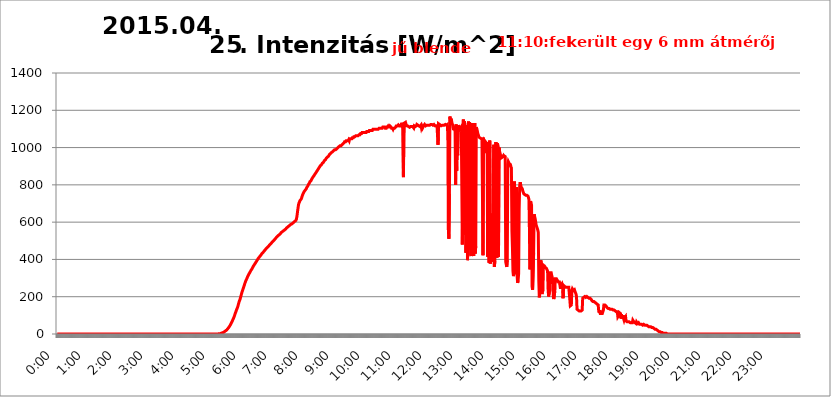
| Category | 2015.04.25. Intenzitás [W/m^2] |
|---|---|
| 0.0 | 0 |
| 0.0006944444444444445 | 0 |
| 0.001388888888888889 | 0 |
| 0.0020833333333333333 | 0 |
| 0.002777777777777778 | 0 |
| 0.003472222222222222 | 0 |
| 0.004166666666666667 | 0 |
| 0.004861111111111111 | 0 |
| 0.005555555555555556 | 0 |
| 0.0062499999999999995 | 0 |
| 0.006944444444444444 | 0 |
| 0.007638888888888889 | 0 |
| 0.008333333333333333 | 0 |
| 0.009027777777777779 | 0 |
| 0.009722222222222222 | 0 |
| 0.010416666666666666 | 0 |
| 0.011111111111111112 | 0 |
| 0.011805555555555555 | 0 |
| 0.012499999999999999 | 0 |
| 0.013194444444444444 | 0 |
| 0.013888888888888888 | 0 |
| 0.014583333333333332 | 0 |
| 0.015277777777777777 | 0 |
| 0.015972222222222224 | 0 |
| 0.016666666666666666 | 0 |
| 0.017361111111111112 | 0 |
| 0.018055555555555557 | 0 |
| 0.01875 | 0 |
| 0.019444444444444445 | 0 |
| 0.02013888888888889 | 0 |
| 0.020833333333333332 | 0 |
| 0.02152777777777778 | 0 |
| 0.022222222222222223 | 0 |
| 0.02291666666666667 | 0 |
| 0.02361111111111111 | 0 |
| 0.024305555555555556 | 0 |
| 0.024999999999999998 | 0 |
| 0.025694444444444447 | 0 |
| 0.02638888888888889 | 0 |
| 0.027083333333333334 | 0 |
| 0.027777777777777776 | 0 |
| 0.02847222222222222 | 0 |
| 0.029166666666666664 | 0 |
| 0.029861111111111113 | 0 |
| 0.030555555555555555 | 0 |
| 0.03125 | 0 |
| 0.03194444444444445 | 0 |
| 0.03263888888888889 | 0 |
| 0.03333333333333333 | 0 |
| 0.034027777777777775 | 0 |
| 0.034722222222222224 | 0 |
| 0.035416666666666666 | 0 |
| 0.036111111111111115 | 0 |
| 0.03680555555555556 | 0 |
| 0.0375 | 0 |
| 0.03819444444444444 | 0 |
| 0.03888888888888889 | 0 |
| 0.03958333333333333 | 0 |
| 0.04027777777777778 | 0 |
| 0.04097222222222222 | 0 |
| 0.041666666666666664 | 0 |
| 0.042361111111111106 | 0 |
| 0.04305555555555556 | 0 |
| 0.043750000000000004 | 0 |
| 0.044444444444444446 | 0 |
| 0.04513888888888889 | 0 |
| 0.04583333333333334 | 0 |
| 0.04652777777777778 | 0 |
| 0.04722222222222222 | 0 |
| 0.04791666666666666 | 0 |
| 0.04861111111111111 | 0 |
| 0.049305555555555554 | 0 |
| 0.049999999999999996 | 0 |
| 0.05069444444444445 | 0 |
| 0.051388888888888894 | 0 |
| 0.052083333333333336 | 0 |
| 0.05277777777777778 | 0 |
| 0.05347222222222222 | 0 |
| 0.05416666666666667 | 0 |
| 0.05486111111111111 | 0 |
| 0.05555555555555555 | 0 |
| 0.05625 | 0 |
| 0.05694444444444444 | 0 |
| 0.057638888888888885 | 0 |
| 0.05833333333333333 | 0 |
| 0.05902777777777778 | 0 |
| 0.059722222222222225 | 0 |
| 0.06041666666666667 | 0 |
| 0.061111111111111116 | 0 |
| 0.06180555555555556 | 0 |
| 0.0625 | 0 |
| 0.06319444444444444 | 0 |
| 0.06388888888888888 | 0 |
| 0.06458333333333334 | 0 |
| 0.06527777777777778 | 0 |
| 0.06597222222222222 | 0 |
| 0.06666666666666667 | 0 |
| 0.06736111111111111 | 0 |
| 0.06805555555555555 | 0 |
| 0.06874999999999999 | 0 |
| 0.06944444444444443 | 0 |
| 0.07013888888888889 | 0 |
| 0.07083333333333333 | 0 |
| 0.07152777777777779 | 0 |
| 0.07222222222222223 | 0 |
| 0.07291666666666667 | 0 |
| 0.07361111111111111 | 0 |
| 0.07430555555555556 | 0 |
| 0.075 | 0 |
| 0.07569444444444444 | 0 |
| 0.0763888888888889 | 0 |
| 0.07708333333333334 | 0 |
| 0.07777777777777778 | 0 |
| 0.07847222222222222 | 0 |
| 0.07916666666666666 | 0 |
| 0.0798611111111111 | 0 |
| 0.08055555555555556 | 0 |
| 0.08125 | 0 |
| 0.08194444444444444 | 0 |
| 0.08263888888888889 | 0 |
| 0.08333333333333333 | 0 |
| 0.08402777777777777 | 0 |
| 0.08472222222222221 | 0 |
| 0.08541666666666665 | 0 |
| 0.08611111111111112 | 0 |
| 0.08680555555555557 | 0 |
| 0.08750000000000001 | 0 |
| 0.08819444444444445 | 0 |
| 0.08888888888888889 | 0 |
| 0.08958333333333333 | 0 |
| 0.09027777777777778 | 0 |
| 0.09097222222222222 | 0 |
| 0.09166666666666667 | 0 |
| 0.09236111111111112 | 0 |
| 0.09305555555555556 | 0 |
| 0.09375 | 0 |
| 0.09444444444444444 | 0 |
| 0.09513888888888888 | 0 |
| 0.09583333333333333 | 0 |
| 0.09652777777777777 | 0 |
| 0.09722222222222222 | 0 |
| 0.09791666666666667 | 0 |
| 0.09861111111111111 | 0 |
| 0.09930555555555555 | 0 |
| 0.09999999999999999 | 0 |
| 0.10069444444444443 | 0 |
| 0.1013888888888889 | 0 |
| 0.10208333333333335 | 0 |
| 0.10277777777777779 | 0 |
| 0.10347222222222223 | 0 |
| 0.10416666666666667 | 0 |
| 0.10486111111111111 | 0 |
| 0.10555555555555556 | 0 |
| 0.10625 | 0 |
| 0.10694444444444444 | 0 |
| 0.1076388888888889 | 0 |
| 0.10833333333333334 | 0 |
| 0.10902777777777778 | 0 |
| 0.10972222222222222 | 0 |
| 0.1111111111111111 | 0 |
| 0.11180555555555556 | 0 |
| 0.11180555555555556 | 0 |
| 0.1125 | 0 |
| 0.11319444444444444 | 0 |
| 0.11388888888888889 | 0 |
| 0.11458333333333333 | 0 |
| 0.11527777777777777 | 0 |
| 0.11597222222222221 | 0 |
| 0.11666666666666665 | 0 |
| 0.1173611111111111 | 0 |
| 0.11805555555555557 | 0 |
| 0.11944444444444445 | 0 |
| 0.12013888888888889 | 0 |
| 0.12083333333333333 | 0 |
| 0.12152777777777778 | 0 |
| 0.12222222222222223 | 0 |
| 0.12291666666666667 | 0 |
| 0.12291666666666667 | 0 |
| 0.12361111111111112 | 0 |
| 0.12430555555555556 | 0 |
| 0.125 | 0 |
| 0.12569444444444444 | 0 |
| 0.12638888888888888 | 0 |
| 0.12708333333333333 | 0 |
| 0.16875 | 0 |
| 0.12847222222222224 | 0 |
| 0.12916666666666668 | 0 |
| 0.12986111111111112 | 0 |
| 0.13055555555555556 | 0 |
| 0.13125 | 0 |
| 0.13194444444444445 | 0 |
| 0.1326388888888889 | 0 |
| 0.13333333333333333 | 0 |
| 0.13402777777777777 | 0 |
| 0.13402777777777777 | 0 |
| 0.13472222222222222 | 0 |
| 0.13541666666666666 | 0 |
| 0.1361111111111111 | 0 |
| 0.13749999999999998 | 0 |
| 0.13819444444444443 | 0 |
| 0.1388888888888889 | 0 |
| 0.13958333333333334 | 0 |
| 0.14027777777777778 | 0 |
| 0.14097222222222222 | 0 |
| 0.14166666666666666 | 0 |
| 0.1423611111111111 | 0 |
| 0.14305555555555557 | 0 |
| 0.14375000000000002 | 0 |
| 0.14444444444444446 | 0 |
| 0.1451388888888889 | 0 |
| 0.1451388888888889 | 0 |
| 0.14652777777777778 | 0 |
| 0.14722222222222223 | 0 |
| 0.14791666666666667 | 0 |
| 0.1486111111111111 | 0 |
| 0.14930555555555555 | 0 |
| 0.15 | 0 |
| 0.15069444444444444 | 0 |
| 0.15138888888888888 | 0 |
| 0.15208333333333332 | 0 |
| 0.15277777777777776 | 0 |
| 0.15347222222222223 | 0 |
| 0.15416666666666667 | 0 |
| 0.15486111111111112 | 0 |
| 0.15555555555555556 | 0 |
| 0.15625 | 0 |
| 0.15694444444444444 | 0 |
| 0.15763888888888888 | 0 |
| 0.15833333333333333 | 0 |
| 0.15902777777777777 | 0 |
| 0.15972222222222224 | 0 |
| 0.16041666666666668 | 0 |
| 0.16111111111111112 | 0 |
| 0.16180555555555556 | 0 |
| 0.1625 | 0 |
| 0.16319444444444445 | 0 |
| 0.1638888888888889 | 0 |
| 0.16458333333333333 | 0 |
| 0.16527777777777777 | 0 |
| 0.16597222222222222 | 0 |
| 0.16666666666666666 | 0 |
| 0.1673611111111111 | 0 |
| 0.16805555555555554 | 0 |
| 0.16874999999999998 | 0 |
| 0.16944444444444443 | 0 |
| 0.17013888888888887 | 0 |
| 0.1708333333333333 | 0 |
| 0.17152777777777775 | 0 |
| 0.17222222222222225 | 0 |
| 0.1729166666666667 | 0 |
| 0.17361111111111113 | 0 |
| 0.17430555555555557 | 0 |
| 0.17500000000000002 | 0 |
| 0.17569444444444446 | 0 |
| 0.1763888888888889 | 0 |
| 0.17708333333333334 | 0 |
| 0.17777777777777778 | 0 |
| 0.17847222222222223 | 0 |
| 0.17916666666666667 | 0 |
| 0.1798611111111111 | 0 |
| 0.18055555555555555 | 0 |
| 0.18125 | 0 |
| 0.18194444444444444 | 0 |
| 0.1826388888888889 | 0 |
| 0.18333333333333335 | 0 |
| 0.1840277777777778 | 0 |
| 0.18472222222222223 | 0 |
| 0.18541666666666667 | 0 |
| 0.18611111111111112 | 0 |
| 0.18680555555555556 | 0 |
| 0.1875 | 0 |
| 0.18819444444444444 | 0 |
| 0.18888888888888888 | 0 |
| 0.18958333333333333 | 0 |
| 0.19027777777777777 | 0 |
| 0.1909722222222222 | 0 |
| 0.19166666666666665 | 0 |
| 0.19236111111111112 | 0 |
| 0.19305555555555554 | 0 |
| 0.19375 | 0 |
| 0.19444444444444445 | 0 |
| 0.1951388888888889 | 0 |
| 0.19583333333333333 | 0 |
| 0.19652777777777777 | 0 |
| 0.19722222222222222 | 0 |
| 0.19791666666666666 | 0 |
| 0.1986111111111111 | 0 |
| 0.19930555555555554 | 0 |
| 0.19999999999999998 | 0 |
| 0.20069444444444443 | 0 |
| 0.20138888888888887 | 0 |
| 0.2020833333333333 | 0 |
| 0.2027777777777778 | 0 |
| 0.2034722222222222 | 0 |
| 0.2041666666666667 | 0 |
| 0.20486111111111113 | 0 |
| 0.20555555555555557 | 0 |
| 0.20625000000000002 | 0 |
| 0.20694444444444446 | 0 |
| 0.2076388888888889 | 0 |
| 0.20833333333333334 | 0 |
| 0.20902777777777778 | 0 |
| 0.20972222222222223 | 0 |
| 0.21041666666666667 | 0 |
| 0.2111111111111111 | 0 |
| 0.21180555555555555 | 0 |
| 0.2125 | 0 |
| 0.21319444444444444 | 0 |
| 0.2138888888888889 | 0 |
| 0.21458333333333335 | 0 |
| 0.2152777777777778 | 0 |
| 0.21597222222222223 | 1.09 |
| 0.21666666666666667 | 1.09 |
| 0.21736111111111112 | 1.09 |
| 0.21805555555555556 | 1.09 |
| 0.21875 | 2.439 |
| 0.21944444444444444 | 2.439 |
| 0.22013888888888888 | 3.791 |
| 0.22083333333333333 | 5.146 |
| 0.22152777777777777 | 6.503 |
| 0.2222222222222222 | 6.503 |
| 0.22291666666666665 | 7.862 |
| 0.2236111111111111 | 9.225 |
| 0.22430555555555556 | 11.956 |
| 0.225 | 13.325 |
| 0.22569444444444445 | 14.696 |
| 0.2263888888888889 | 17.444 |
| 0.22708333333333333 | 18.822 |
| 0.22777777777777777 | 21.582 |
| 0.22847222222222222 | 24.35 |
| 0.22916666666666666 | 28.514 |
| 0.2298611111111111 | 31.297 |
| 0.23055555555555554 | 35.483 |
| 0.23124999999999998 | 39.68 |
| 0.23194444444444443 | 43.886 |
| 0.23263888888888887 | 48.1 |
| 0.2333333333333333 | 53.73 |
| 0.2340277777777778 | 59.368 |
| 0.2347222222222222 | 65.012 |
| 0.2354166666666667 | 70.658 |
| 0.23611111111111113 | 77.715 |
| 0.23680555555555557 | 83.356 |
| 0.23750000000000002 | 90.399 |
| 0.23819444444444446 | 97.427 |
| 0.2388888888888889 | 105.834 |
| 0.23958333333333334 | 114.207 |
| 0.24027777777777778 | 121.152 |
| 0.24097222222222223 | 129.444 |
| 0.24166666666666667 | 136.314 |
| 0.2423611111111111 | 143.144 |
| 0.24305555555555555 | 152.637 |
| 0.24375 | 163.378 |
| 0.24444444444444446 | 172.676 |
| 0.24513888888888888 | 180.569 |
| 0.24583333333333335 | 188.389 |
| 0.2465277777777778 | 198.701 |
| 0.24722222222222223 | 208.881 |
| 0.24791666666666667 | 218.93 |
| 0.24861111111111112 | 228.852 |
| 0.24930555555555556 | 236.212 |
| 0.25 | 244.717 |
| 0.25069444444444444 | 253.137 |
| 0.2513888888888889 | 261.48 |
| 0.2520833333333333 | 270.931 |
| 0.25277777777777777 | 277.967 |
| 0.2534722222222222 | 286.13 |
| 0.25416666666666665 | 290.777 |
| 0.2548611111111111 | 297.728 |
| 0.2555555555555556 | 304.664 |
| 0.25625000000000003 | 309.284 |
| 0.2569444444444445 | 316.215 |
| 0.2576388888888889 | 321.998 |
| 0.25833333333333336 | 326.633 |
| 0.2590277777777778 | 331.279 |
| 0.25972222222222224 | 335.941 |
| 0.2604166666666667 | 341.794 |
| 0.2611111111111111 | 345.322 |
| 0.26180555555555557 | 350.049 |
| 0.2625 | 355.999 |
| 0.26319444444444445 | 360.798 |
| 0.2638888888888889 | 365.635 |
| 0.26458333333333334 | 369.291 |
| 0.2652777777777778 | 374.206 |
| 0.2659722222222222 | 379.171 |
| 0.26666666666666666 | 382.93 |
| 0.2673611111111111 | 386.723 |
| 0.26805555555555555 | 391.834 |
| 0.26875 | 397.012 |
| 0.26944444444444443 | 400.943 |
| 0.2701388888888889 | 404.916 |
| 0.2708333333333333 | 408.934 |
| 0.27152777777777776 | 411.638 |
| 0.2722222222222222 | 415.735 |
| 0.27291666666666664 | 419.883 |
| 0.2736111111111111 | 422.678 |
| 0.2743055555555555 | 426.916 |
| 0.27499999999999997 | 431.211 |
| 0.27569444444444446 | 434.107 |
| 0.27638888888888885 | 437.031 |
| 0.27708333333333335 | 439.982 |
| 0.2777777777777778 | 442.962 |
| 0.27847222222222223 | 447.487 |
| 0.2791666666666667 | 450.542 |
| 0.2798611111111111 | 453.629 |
| 0.28055555555555556 | 456.747 |
| 0.28125 | 459.898 |
| 0.28194444444444444 | 463.083 |
| 0.2826388888888889 | 466.302 |
| 0.2833333333333333 | 467.925 |
| 0.28402777777777777 | 471.198 |
| 0.2847222222222222 | 474.507 |
| 0.28541666666666665 | 477.854 |
| 0.28611111111111115 | 481.238 |
| 0.28680555555555554 | 482.945 |
| 0.28750000000000003 | 486.389 |
| 0.2881944444444445 | 489.873 |
| 0.2888888888888889 | 493.398 |
| 0.28958333333333336 | 495.176 |
| 0.2902777777777778 | 498.764 |
| 0.29097222222222224 | 502.396 |
| 0.2916666666666667 | 504.229 |
| 0.2923611111111111 | 507.927 |
| 0.29305555555555557 | 511.671 |
| 0.29375 | 513.561 |
| 0.29444444444444445 | 517.375 |
| 0.2951388888888889 | 519.3 |
| 0.29583333333333334 | 523.186 |
| 0.2965277777777778 | 525.148 |
| 0.2972222222222222 | 529.108 |
| 0.29791666666666666 | 531.108 |
| 0.2986111111111111 | 533.12 |
| 0.29930555555555555 | 537.182 |
| 0.3 | 539.234 |
| 0.30069444444444443 | 541.298 |
| 0.3013888888888889 | 545.467 |
| 0.3020833333333333 | 547.572 |
| 0.30277777777777776 | 549.691 |
| 0.3034722222222222 | 551.823 |
| 0.30416666666666664 | 553.97 |
| 0.3048611111111111 | 556.131 |
| 0.3055555555555555 | 558.305 |
| 0.30624999999999997 | 560.495 |
| 0.3069444444444444 | 562.699 |
| 0.3076388888888889 | 564.917 |
| 0.30833333333333335 | 569.398 |
| 0.3090277777777778 | 571.661 |
| 0.30972222222222223 | 573.939 |
| 0.3104166666666667 | 576.233 |
| 0.3111111111111111 | 578.542 |
| 0.31180555555555556 | 580.866 |
| 0.3125 | 583.206 |
| 0.31319444444444444 | 585.562 |
| 0.3138888888888889 | 587.934 |
| 0.3145833333333333 | 590.321 |
| 0.31527777777777777 | 590.321 |
| 0.3159722222222222 | 595.145 |
| 0.31666666666666665 | 595.145 |
| 0.31736111111111115 | 597.582 |
| 0.31805555555555554 | 600.035 |
| 0.31875000000000003 | 602.505 |
| 0.3194444444444445 | 604.992 |
| 0.3201388888888889 | 607.495 |
| 0.32083333333333336 | 610.016 |
| 0.3215277777777778 | 617.682 |
| 0.32222222222222224 | 633.495 |
| 0.3229166666666667 | 655.618 |
| 0.3236111111111111 | 676.003 |
| 0.32430555555555557 | 694.278 |
| 0.325 | 703.704 |
| 0.32569444444444445 | 710.098 |
| 0.3263888888888889 | 716.58 |
| 0.32708333333333334 | 716.58 |
| 0.3277777777777778 | 723.153 |
| 0.3284722222222222 | 729.817 |
| 0.32916666666666666 | 739.988 |
| 0.3298611111111111 | 746.886 |
| 0.33055555555555555 | 753.881 |
| 0.33125 | 757.414 |
| 0.33194444444444443 | 764.555 |
| 0.3326388888888889 | 764.555 |
| 0.3333333333333333 | 771.794 |
| 0.3340277777777778 | 775.451 |
| 0.3347222222222222 | 779.134 |
| 0.3354166666666667 | 786.575 |
| 0.3361111111111111 | 790.334 |
| 0.3368055555555556 | 794.119 |
| 0.33749999999999997 | 801.768 |
| 0.33819444444444446 | 805.632 |
| 0.33888888888888885 | 809.522 |
| 0.33958333333333335 | 817.382 |
| 0.34027777777777773 | 817.382 |
| 0.34097222222222223 | 821.353 |
| 0.3416666666666666 | 825.351 |
| 0.3423611111111111 | 833.43 |
| 0.3430555555555555 | 833.43 |
| 0.34375 | 841.619 |
| 0.3444444444444445 | 845.755 |
| 0.3451388888888889 | 849.92 |
| 0.3458333333333334 | 854.113 |
| 0.34652777777777777 | 858.335 |
| 0.34722222222222227 | 862.585 |
| 0.34791666666666665 | 866.865 |
| 0.34861111111111115 | 871.173 |
| 0.34930555555555554 | 875.511 |
| 0.35000000000000003 | 879.878 |
| 0.3506944444444444 | 884.274 |
| 0.3513888888888889 | 884.274 |
| 0.3520833333333333 | 893.157 |
| 0.3527777777777778 | 897.643 |
| 0.3534722222222222 | 902.16 |
| 0.3541666666666667 | 902.16 |
| 0.3548611111111111 | 906.707 |
| 0.35555555555555557 | 906.707 |
| 0.35625 | 915.893 |
| 0.35694444444444445 | 915.893 |
| 0.3576388888888889 | 920.533 |
| 0.35833333333333334 | 925.203 |
| 0.3590277777777778 | 929.905 |
| 0.3597222222222222 | 929.905 |
| 0.36041666666666666 | 934.639 |
| 0.3611111111111111 | 939.404 |
| 0.36180555555555555 | 944.201 |
| 0.3625 | 944.201 |
| 0.36319444444444443 | 949.03 |
| 0.3638888888888889 | 953.892 |
| 0.3645833333333333 | 953.892 |
| 0.3652777777777778 | 958.785 |
| 0.3659722222222222 | 963.712 |
| 0.3666666666666667 | 963.712 |
| 0.3673611111111111 | 968.671 |
| 0.3680555555555556 | 968.671 |
| 0.36874999999999997 | 973.663 |
| 0.36944444444444446 | 973.663 |
| 0.37013888888888885 | 978.688 |
| 0.37083333333333335 | 978.688 |
| 0.37152777777777773 | 983.747 |
| 0.37222222222222223 | 983.747 |
| 0.3729166666666666 | 988.839 |
| 0.3736111111111111 | 988.839 |
| 0.3743055555555555 | 988.839 |
| 0.375 | 993.965 |
| 0.3756944444444445 | 993.965 |
| 0.3763888888888889 | 993.965 |
| 0.3770833333333334 | 999.125 |
| 0.37777777777777777 | 1004.318 |
| 0.37847222222222227 | 1004.318 |
| 0.37916666666666665 | 1004.318 |
| 0.37986111111111115 | 1009.546 |
| 0.38055555555555554 | 1009.546 |
| 0.38125000000000003 | 1009.546 |
| 0.3819444444444444 | 1014.809 |
| 0.3826388888888889 | 1014.809 |
| 0.3833333333333333 | 1020.106 |
| 0.3840277777777778 | 1020.106 |
| 0.3847222222222222 | 1025.437 |
| 0.3854166666666667 | 1025.437 |
| 0.3861111111111111 | 1030.804 |
| 0.38680555555555557 | 1030.804 |
| 0.3875 | 1030.804 |
| 0.38819444444444445 | 1036.206 |
| 0.3888888888888889 | 1036.206 |
| 0.38958333333333334 | 1036.206 |
| 0.3902777777777778 | 1036.206 |
| 0.3909722222222222 | 1036.206 |
| 0.39166666666666666 | 1041.644 |
| 0.3923611111111111 | 1036.206 |
| 0.39305555555555555 | 1047.117 |
| 0.39375 | 1047.117 |
| 0.39444444444444443 | 1047.117 |
| 0.3951388888888889 | 1047.117 |
| 0.3958333333333333 | 1047.117 |
| 0.3965277777777778 | 1052.625 |
| 0.3972222222222222 | 1052.625 |
| 0.3979166666666667 | 1052.625 |
| 0.3986111111111111 | 1058.17 |
| 0.3993055555555556 | 1058.17 |
| 0.39999999999999997 | 1058.17 |
| 0.40069444444444446 | 1058.17 |
| 0.40138888888888885 | 1063.751 |
| 0.40208333333333335 | 1063.751 |
| 0.40277777777777773 | 1063.751 |
| 0.40347222222222223 | 1063.751 |
| 0.4041666666666666 | 1063.751 |
| 0.4048611111111111 | 1063.751 |
| 0.4055555555555555 | 1069.368 |
| 0.40625 | 1069.368 |
| 0.4069444444444445 | 1069.368 |
| 0.4076388888888889 | 1075.021 |
| 0.4083333333333334 | 1075.021 |
| 0.40902777777777777 | 1075.021 |
| 0.40972222222222227 | 1080.711 |
| 0.41041666666666665 | 1080.711 |
| 0.41111111111111115 | 1080.711 |
| 0.41180555555555554 | 1080.711 |
| 0.41250000000000003 | 1080.711 |
| 0.4131944444444444 | 1080.711 |
| 0.4138888888888889 | 1080.711 |
| 0.4145833333333333 | 1080.711 |
| 0.4152777777777778 | 1080.711 |
| 0.4159722222222222 | 1086.439 |
| 0.4166666666666667 | 1086.439 |
| 0.4173611111111111 | 1086.439 |
| 0.41805555555555557 | 1086.439 |
| 0.41875 | 1086.439 |
| 0.41944444444444445 | 1092.203 |
| 0.4201388888888889 | 1092.203 |
| 0.42083333333333334 | 1092.203 |
| 0.4215277777777778 | 1092.203 |
| 0.4222222222222222 | 1092.203 |
| 0.42291666666666666 | 1092.203 |
| 0.4236111111111111 | 1092.203 |
| 0.42430555555555555 | 1098.004 |
| 0.425 | 1098.004 |
| 0.42569444444444443 | 1098.004 |
| 0.4263888888888889 | 1098.004 |
| 0.4270833333333333 | 1098.004 |
| 0.4277777777777778 | 1098.004 |
| 0.4284722222222222 | 1098.004 |
| 0.4291666666666667 | 1098.004 |
| 0.4298611111111111 | 1098.004 |
| 0.4305555555555556 | 1098.004 |
| 0.43124999999999997 | 1098.004 |
| 0.43194444444444446 | 1098.004 |
| 0.43263888888888885 | 1103.843 |
| 0.43333333333333335 | 1103.843 |
| 0.43402777777777773 | 1103.843 |
| 0.43472222222222223 | 1103.843 |
| 0.4354166666666666 | 1103.843 |
| 0.4361111111111111 | 1103.843 |
| 0.4368055555555555 | 1103.843 |
| 0.4375 | 1109.72 |
| 0.4381944444444445 | 1109.72 |
| 0.4388888888888889 | 1109.72 |
| 0.4395833333333334 | 1109.72 |
| 0.44027777777777777 | 1109.72 |
| 0.44097222222222227 | 1103.843 |
| 0.44166666666666665 | 1103.843 |
| 0.44236111111111115 | 1103.843 |
| 0.44305555555555554 | 1109.72 |
| 0.44375000000000003 | 1109.72 |
| 0.4444444444444444 | 1115.634 |
| 0.4451388888888889 | 1109.72 |
| 0.4458333333333333 | 1109.72 |
| 0.4465277777777778 | 1109.72 |
| 0.4472222222222222 | 1115.634 |
| 0.4479166666666667 | 1115.634 |
| 0.4486111111111111 | 1109.72 |
| 0.44930555555555557 | 1103.843 |
| 0.45 | 1103.843 |
| 0.45069444444444445 | 1103.843 |
| 0.4513888888888889 | 1098.004 |
| 0.45208333333333334 | 1103.843 |
| 0.4527777777777778 | 1103.843 |
| 0.4534722222222222 | 1103.843 |
| 0.45416666666666666 | 1103.843 |
| 0.4548611111111111 | 1109.72 |
| 0.45555555555555555 | 1115.634 |
| 0.45625 | 1115.634 |
| 0.45694444444444443 | 1115.634 |
| 0.4576388888888889 | 1115.634 |
| 0.4583333333333333 | 1121.587 |
| 0.4590277777777778 | 1121.587 |
| 0.4597222222222222 | 1115.634 |
| 0.4604166666666667 | 1115.634 |
| 0.4611111111111111 | 1115.634 |
| 0.4618055555555556 | 1121.587 |
| 0.46249999999999997 | 1121.587 |
| 0.46319444444444446 | 1115.634 |
| 0.46388888888888885 | 1121.587 |
| 0.46458333333333335 | 1133.607 |
| 0.46527777777777773 | 841.526 |
| 0.46597222222222223 | 1112.618 |
| 0.4666666666666666 | 1131.708 |
| 0.4673611111111111 | 1127.879 |
| 0.4680555555555555 | 1135.543 |
| 0.46875 | 1135.543 |
| 0.4694444444444445 | 1116.426 |
| 0.4701388888888889 | 1116.426 |
| 0.4708333333333334 | 1116.426 |
| 0.47152777777777777 | 1116.426 |
| 0.47222222222222227 | 1112.618 |
| 0.47291666666666665 | 1108.816 |
| 0.47361111111111115 | 1108.816 |
| 0.47430555555555554 | 1108.816 |
| 0.47500000000000003 | 1112.618 |
| 0.4756944444444444 | 1108.816 |
| 0.4763888888888889 | 1112.618 |
| 0.4770833333333333 | 1108.816 |
| 0.4777777777777778 | 1112.618 |
| 0.4784722222222222 | 1112.618 |
| 0.4791666666666667 | 1105.019 |
| 0.4798611111111111 | 1116.426 |
| 0.48055555555555557 | 1112.618 |
| 0.48125 | 1112.618 |
| 0.48194444444444445 | 1116.426 |
| 0.4826388888888889 | 1116.426 |
| 0.48333333333333334 | 1124.056 |
| 0.4840277777777778 | 1120.238 |
| 0.4847222222222222 | 1120.238 |
| 0.48541666666666666 | 1120.238 |
| 0.4861111111111111 | 1116.426 |
| 0.48680555555555555 | 1112.618 |
| 0.4875 | 1112.618 |
| 0.48819444444444443 | 1116.426 |
| 0.4888888888888889 | 1120.238 |
| 0.4895833333333333 | 1105.019 |
| 0.4902777777777778 | 1112.618 |
| 0.4909722222222222 | 1105.019 |
| 0.4916666666666667 | 1108.816 |
| 0.4923611111111111 | 1116.426 |
| 0.4930555555555556 | 1120.238 |
| 0.49374999999999997 | 1124.056 |
| 0.49444444444444446 | 1124.056 |
| 0.49513888888888885 | 1116.426 |
| 0.49583333333333335 | 1112.618 |
| 0.49652777777777773 | 1120.238 |
| 0.49722222222222223 | 1120.238 |
| 0.4979166666666666 | 1120.238 |
| 0.4986111111111111 | 1120.238 |
| 0.4993055555555555 | 1120.238 |
| 0.5 | 1120.238 |
| 0.5006944444444444 | 1120.238 |
| 0.5013888888888889 | 1120.238 |
| 0.5020833333333333 | 1124.056 |
| 0.5027777777777778 | 1124.056 |
| 0.5034722222222222 | 1124.056 |
| 0.5041666666666667 | 1120.238 |
| 0.5048611111111111 | 1120.238 |
| 0.5055555555555555 | 1124.056 |
| 0.50625 | 1124.056 |
| 0.5069444444444444 | 1120.238 |
| 0.5076388888888889 | 1116.426 |
| 0.5083333333333333 | 1116.426 |
| 0.5090277777777777 | 1116.426 |
| 0.5097222222222222 | 1116.426 |
| 0.5104166666666666 | 1116.426 |
| 0.5111111111111112 | 1116.426 |
| 0.5118055555555555 | 1014.852 |
| 0.5125000000000001 | 1127.879 |
| 0.5131944444444444 | 1124.056 |
| 0.513888888888889 | 1124.056 |
| 0.5145833333333333 | 1116.426 |
| 0.5152777777777778 | 1112.618 |
| 0.5159722222222222 | 1116.426 |
| 0.5166666666666667 | 1120.238 |
| 0.517361111111111 | 1120.238 |
| 0.5180555555555556 | 1120.238 |
| 0.5187499999999999 | 1120.238 |
| 0.5194444444444445 | 1120.238 |
| 0.5201388888888888 | 1120.238 |
| 0.5208333333333334 | 1124.056 |
| 0.5215277777777778 | 1124.056 |
| 0.5222222222222223 | 1124.056 |
| 0.5229166666666667 | 1120.238 |
| 0.5236111111111111 | 1120.238 |
| 0.5243055555555556 | 1124.056 |
| 0.525 | 1059.756 |
| 0.5256944444444445 | 558.261 |
| 0.5263888888888889 | 510.885 |
| 0.5270833333333333 | 751.803 |
| 0.5277777777777778 | 1166.46 |
| 0.5284722222222222 | 1135.543 |
| 0.5291666666666667 | 1154.814 |
| 0.5298611111111111 | 1147.086 |
| 0.5305555555555556 | 1131.708 |
| 0.53125 | 1124.056 |
| 0.5319444444444444 | 1120.238 |
| 0.5326388888888889 | 1093.653 |
| 0.5333333333333333 | 1112.618 |
| 0.5340277777777778 | 1108.816 |
| 0.5347222222222222 | 1089.873 |
| 0.5354166666666667 | 798.974 |
| 0.5361111111111111 | 1124.056 |
| 0.5368055555555555 | 875.918 |
| 0.5375 | 999.916 |
| 0.5381944444444444 | 958.814 |
| 0.5388888888888889 | 1120.238 |
| 0.5395833333333333 | 1108.816 |
| 0.5402777777777777 | 1112.618 |
| 0.5409722222222222 | 1086.097 |
| 0.5416666666666666 | 1105.019 |
| 0.5423611111111112 | 1105.019 |
| 0.5430555555555555 | 1112.618 |
| 0.5437500000000001 | 1116.426 |
| 0.5444444444444444 | 480.356 |
| 0.545138888888889 | 759.723 |
| 0.5458333333333333 | 1150.946 |
| 0.5465277777777778 | 532.513 |
| 0.5472222222222222 | 1139.384 |
| 0.5479166666666667 | 1124.056 |
| 0.548611111111111 | 1116.426 |
| 0.5493055555555556 | 436.27 |
| 0.5499999999999999 | 1120.238 |
| 0.5506944444444445 | 1105.019 |
| 0.5513888888888888 | 396.164 |
| 0.5520833333333334 | 471.582 |
| 0.5527777777777778 | 1139.384 |
| 0.5534722222222223 | 453.968 |
| 0.5541666666666667 | 1135.543 |
| 0.5548611111111111 | 1026.06 |
| 0.5555555555555556 | 427.39 |
| 0.55625 | 418.492 |
| 0.5569444444444445 | 440.702 |
| 0.5576388888888889 | 1131.708 |
| 0.5583333333333333 | 999.916 |
| 0.5590277777777778 | 436.27 |
| 0.5597222222222222 | 418.492 |
| 0.5604166666666667 | 471.582 |
| 0.5611111111111111 | 1131.708 |
| 0.5618055555555556 | 431.833 |
| 0.5625 | 471.582 |
| 0.5631944444444444 | 1108.816 |
| 0.5638888888888889 | 1101.226 |
| 0.5645833333333333 | 1089.873 |
| 0.5652777777777778 | 1074.789 |
| 0.5659722222222222 | 1067.267 |
| 0.5666666666666667 | 1056.004 |
| 0.5673611111111111 | 1052.255 |
| 0.5680555555555555 | 1052.255 |
| 0.56875 | 1052.255 |
| 0.5694444444444444 | 1048.508 |
| 0.5701388888888889 | 1044.762 |
| 0.5708333333333333 | 1044.762 |
| 0.5715277777777777 | 1044.762 |
| 0.5722222222222222 | 422.943 |
| 0.5729166666666666 | 1052.255 |
| 0.5736111111111112 | 970.034 |
| 0.5743055555555555 | 1037.277 |
| 0.5750000000000001 | 1037.277 |
| 0.5756944444444444 | 1029.798 |
| 0.576388888888889 | 1026.06 |
| 0.5770833333333333 | 1022.323 |
| 0.5777777777777778 | 996.182 |
| 0.5784722222222222 | 414.035 |
| 0.5791666666666667 | 913.766 |
| 0.579861111111111 | 1029.798 |
| 0.5805555555555556 | 382.715 |
| 0.5812499999999999 | 1037.277 |
| 0.5819444444444445 | 378.224 |
| 0.5826388888888888 | 396.164 |
| 0.5833333333333334 | 646.537 |
| 0.5840277777777778 | 506.542 |
| 0.5847222222222223 | 387.202 |
| 0.5854166666666667 | 396.164 |
| 0.5861111111111111 | 864.493 |
| 0.5868055555555556 | 1014.852 |
| 0.5875 | 360.221 |
| 0.5881944444444445 | 391.685 |
| 0.5888888888888889 | 391.685 |
| 0.5895833333333333 | 1029.798 |
| 0.5902777777777778 | 440.702 |
| 0.5909722222222222 | 409.574 |
| 0.5916666666666667 | 1022.323 |
| 0.5923611111111111 | 1003.65 |
| 0.5930555555555556 | 414.035 |
| 0.59375 | 999.916 |
| 0.5944444444444444 | 981.244 |
| 0.5951388888888889 | 970.034 |
| 0.5958333333333333 | 958.814 |
| 0.5965277777777778 | 943.832 |
| 0.5972222222222222 | 947.58 |
| 0.5979166666666667 | 947.58 |
| 0.5986111111111111 | 943.832 |
| 0.5993055555555555 | 955.071 |
| 0.6 | 943.832 |
| 0.6006944444444444 | 955.071 |
| 0.6013888888888889 | 955.071 |
| 0.6020833333333333 | 951.327 |
| 0.6027777777777777 | 387.202 |
| 0.6034722222222222 | 373.729 |
| 0.6041666666666666 | 360.221 |
| 0.6048611111111112 | 396.164 |
| 0.6055555555555555 | 909.996 |
| 0.6062500000000001 | 925.06 |
| 0.6069444444444444 | 921.298 |
| 0.607638888888889 | 913.766 |
| 0.6083333333333333 | 913.766 |
| 0.6090277777777778 | 909.996 |
| 0.6097222222222222 | 898.668 |
| 0.6104166666666667 | 891.099 |
| 0.611111111111111 | 553.986 |
| 0.6118055555555556 | 462.786 |
| 0.6124999999999999 | 337.639 |
| 0.6131944444444445 | 310.44 |
| 0.6138888888888888 | 333.113 |
| 0.6145833333333334 | 818.392 |
| 0.6152777777777778 | 324.052 |
| 0.6159722222222223 | 373.729 |
| 0.6166666666666667 | 699.717 |
| 0.6173611111111111 | 787.258 |
| 0.6180555555555556 | 314.98 |
| 0.61875 | 274.047 |
| 0.6194444444444445 | 287.709 |
| 0.6201388888888889 | 324.052 |
| 0.6208333333333333 | 671.22 |
| 0.6215277777777778 | 795.074 |
| 0.6222222222222222 | 814.519 |
| 0.6229166666666667 | 798.974 |
| 0.6236111111111111 | 787.258 |
| 0.6243055555555556 | 783.342 |
| 0.625 | 779.42 |
| 0.6256944444444444 | 767.62 |
| 0.6263888888888889 | 759.723 |
| 0.6270833333333333 | 751.803 |
| 0.6277777777777778 | 751.803 |
| 0.6284722222222222 | 747.834 |
| 0.6291666666666667 | 743.859 |
| 0.6298611111111111 | 743.859 |
| 0.6305555555555555 | 743.859 |
| 0.63125 | 743.859 |
| 0.6319444444444444 | 743.859 |
| 0.6326388888888889 | 739.877 |
| 0.6333333333333333 | 731.896 |
| 0.6340277777777777 | 719.877 |
| 0.6347222222222222 | 719.877 |
| 0.6354166666666666 | 346.682 |
| 0.6361111111111112 | 711.832 |
| 0.6368055555555555 | 703.762 |
| 0.6375000000000001 | 691.608 |
| 0.6381944444444444 | 255.813 |
| 0.638888888888889 | 237.564 |
| 0.6395833333333333 | 242.127 |
| 0.6402777777777778 | 436.27 |
| 0.6409722222222222 | 642.4 |
| 0.6416666666666667 | 629.948 |
| 0.642361111111111 | 617.436 |
| 0.6430555555555556 | 600.661 |
| 0.6437499999999999 | 583.779 |
| 0.6444444444444445 | 575.299 |
| 0.6451388888888888 | 566.793 |
| 0.6458333333333334 | 558.261 |
| 0.6465277777777778 | 545.416 |
| 0.6472222222222223 | 287.709 |
| 0.6479166666666667 | 196.497 |
| 0.6486111111111111 | 214.746 |
| 0.6493055555555556 | 333.113 |
| 0.65 | 396.164 |
| 0.6506944444444445 | 283.156 |
| 0.6513888888888889 | 214.746 |
| 0.6520833333333333 | 223.873 |
| 0.6527777777777778 | 233 |
| 0.6534722222222222 | 369.23 |
| 0.6541666666666667 | 364.728 |
| 0.6548611111111111 | 364.728 |
| 0.6555555555555556 | 360.221 |
| 0.65625 | 355.712 |
| 0.6569444444444444 | 351.198 |
| 0.6576388888888889 | 351.198 |
| 0.6583333333333333 | 351.198 |
| 0.6590277777777778 | 337.639 |
| 0.6597222222222222 | 242.127 |
| 0.6604166666666667 | 201.058 |
| 0.6611111111111111 | 205.62 |
| 0.6618055555555555 | 233 |
| 0.6625 | 328.584 |
| 0.6631944444444444 | 328.584 |
| 0.6638888888888889 | 328.584 |
| 0.6645833333333333 | 314.98 |
| 0.6652777777777777 | 319.517 |
| 0.6659722222222222 | 292.259 |
| 0.6666666666666666 | 201.058 |
| 0.6673611111111111 | 187.378 |
| 0.6680555555555556 | 182.82 |
| 0.6687500000000001 | 228.436 |
| 0.6694444444444444 | 296.808 |
| 0.6701388888888888 | 296.808 |
| 0.6708333333333334 | 296.808 |
| 0.6715277777777778 | 292.259 |
| 0.6722222222222222 | 287.709 |
| 0.6729166666666666 | 283.156 |
| 0.6736111111111112 | 278.603 |
| 0.6743055555555556 | 278.603 |
| 0.6749999999999999 | 278.603 |
| 0.6756944444444444 | 278.603 |
| 0.6763888888888889 | 242.127 |
| 0.6770833333333334 | 260.373 |
| 0.6777777777777777 | 255.813 |
| 0.6784722222222223 | 269.49 |
| 0.6791666666666667 | 260.373 |
| 0.6798611111111111 | 191.937 |
| 0.6805555555555555 | 260.373 |
| 0.68125 | 260.373 |
| 0.6819444444444445 | 255.813 |
| 0.6826388888888889 | 255.813 |
| 0.6833333333333332 | 251.251 |
| 0.6840277777777778 | 251.251 |
| 0.6847222222222222 | 251.251 |
| 0.6854166666666667 | 251.251 |
| 0.686111111111111 | 251.251 |
| 0.6868055555555556 | 251.251 |
| 0.6875 | 251.251 |
| 0.6881944444444444 | 255.813 |
| 0.688888888888889 | 187.378 |
| 0.6895833333333333 | 150.964 |
| 0.6902777777777778 | 146.423 |
| 0.6909722222222222 | 155.509 |
| 0.6916666666666668 | 233 |
| 0.6923611111111111 | 242.127 |
| 0.6930555555555555 | 242.127 |
| 0.69375 | 233 |
| 0.6944444444444445 | 237.564 |
| 0.6951388888888889 | 237.564 |
| 0.6958333333333333 | 228.436 |
| 0.6965277777777777 | 223.873 |
| 0.6972222222222223 | 214.746 |
| 0.6979166666666666 | 201.058 |
| 0.6986111111111111 | 132.814 |
| 0.6993055555555556 | 128.284 |
| 0.7000000000000001 | 128.284 |
| 0.7006944444444444 | 123.758 |
| 0.7013888888888888 | 123.758 |
| 0.7020833333333334 | 123.758 |
| 0.7027777777777778 | 123.758 |
| 0.7034722222222222 | 123.758 |
| 0.7041666666666666 | 123.758 |
| 0.7048611111111112 | 128.284 |
| 0.7055555555555556 | 128.284 |
| 0.7062499999999999 | 191.937 |
| 0.7069444444444444 | 196.497 |
| 0.7076388888888889 | 196.497 |
| 0.7083333333333334 | 196.497 |
| 0.7090277777777777 | 201.058 |
| 0.7097222222222223 | 201.058 |
| 0.7104166666666667 | 196.497 |
| 0.7111111111111111 | 201.058 |
| 0.7118055555555555 | 201.058 |
| 0.7125 | 201.058 |
| 0.7131944444444445 | 196.497 |
| 0.7138888888888889 | 191.937 |
| 0.7145833333333332 | 191.937 |
| 0.7152777777777778 | 191.937 |
| 0.7159722222222222 | 191.937 |
| 0.7166666666666667 | 191.937 |
| 0.717361111111111 | 187.378 |
| 0.7180555555555556 | 182.82 |
| 0.71875 | 178.264 |
| 0.7194444444444444 | 173.709 |
| 0.720138888888889 | 173.709 |
| 0.7208333333333333 | 173.709 |
| 0.7215277777777778 | 173.709 |
| 0.7222222222222222 | 173.709 |
| 0.7229166666666668 | 169.156 |
| 0.7236111111111111 | 169.156 |
| 0.7243055555555555 | 164.605 |
| 0.725 | 164.605 |
| 0.7256944444444445 | 160.056 |
| 0.7263888888888889 | 155.509 |
| 0.7270833333333333 | 155.509 |
| 0.7277777777777777 | 123.758 |
| 0.7284722222222223 | 114.716 |
| 0.7291666666666666 | 128.284 |
| 0.7298611111111111 | 110.201 |
| 0.7305555555555556 | 110.201 |
| 0.7312500000000001 | 110.201 |
| 0.7319444444444444 | 110.201 |
| 0.7326388888888888 | 110.201 |
| 0.7333333333333334 | 114.716 |
| 0.7340277777777778 | 128.284 |
| 0.7347222222222222 | 155.509 |
| 0.7354166666666666 | 155.509 |
| 0.7361111111111112 | 155.509 |
| 0.7368055555555556 | 155.509 |
| 0.7374999999999999 | 150.964 |
| 0.7381944444444444 | 146.423 |
| 0.7388888888888889 | 141.884 |
| 0.7395833333333334 | 141.884 |
| 0.7402777777777777 | 137.347 |
| 0.7409722222222223 | 137.347 |
| 0.7416666666666667 | 137.347 |
| 0.7423611111111111 | 137.347 |
| 0.7430555555555555 | 132.814 |
| 0.74375 | 132.814 |
| 0.7444444444444445 | 132.814 |
| 0.7451388888888889 | 132.814 |
| 0.7458333333333332 | 132.814 |
| 0.7465277777777778 | 132.814 |
| 0.7472222222222222 | 128.284 |
| 0.7479166666666667 | 128.284 |
| 0.748611111111111 | 128.284 |
| 0.7493055555555556 | 128.284 |
| 0.75 | 123.758 |
| 0.7506944444444444 | 123.758 |
| 0.751388888888889 | 119.235 |
| 0.7520833333333333 | 119.235 |
| 0.7527777777777778 | 119.235 |
| 0.7534722222222222 | 92.184 |
| 0.7541666666666668 | 92.184 |
| 0.7548611111111111 | 101.184 |
| 0.7555555555555555 | 114.716 |
| 0.75625 | 110.201 |
| 0.7569444444444445 | 110.201 |
| 0.7576388888888889 | 83.205 |
| 0.7583333333333333 | 105.69 |
| 0.7590277777777777 | 83.205 |
| 0.7597222222222223 | 83.205 |
| 0.7604166666666666 | 101.184 |
| 0.7611111111111111 | 83.205 |
| 0.7618055555555556 | 74.246 |
| 0.7625000000000001 | 83.205 |
| 0.7631944444444444 | 87.692 |
| 0.7638888888888888 | 92.184 |
| 0.7645833333333334 | 69.775 |
| 0.7652777777777778 | 69.775 |
| 0.7659722222222222 | 65.31 |
| 0.7666666666666666 | 65.31 |
| 0.7673611111111112 | 65.31 |
| 0.7680555555555556 | 65.31 |
| 0.7687499999999999 | 65.31 |
| 0.7694444444444444 | 60.85 |
| 0.7701388888888889 | 60.85 |
| 0.7708333333333334 | 60.85 |
| 0.7715277777777777 | 60.85 |
| 0.7722222222222223 | 60.85 |
| 0.7729166666666667 | 60.85 |
| 0.7736111111111111 | 74.246 |
| 0.7743055555555555 | 69.775 |
| 0.775 | 65.31 |
| 0.7756944444444445 | 69.775 |
| 0.7763888888888889 | 60.85 |
| 0.7770833333333332 | 56.398 |
| 0.7777777777777778 | 56.398 |
| 0.7784722222222222 | 65.31 |
| 0.7791666666666667 | 60.85 |
| 0.779861111111111 | 56.398 |
| 0.7805555555555556 | 56.398 |
| 0.78125 | 60.85 |
| 0.7819444444444444 | 56.398 |
| 0.782638888888889 | 51.951 |
| 0.7833333333333333 | 51.951 |
| 0.7840277777777778 | 51.951 |
| 0.7847222222222222 | 51.951 |
| 0.7854166666666668 | 51.951 |
| 0.7861111111111111 | 51.951 |
| 0.7868055555555555 | 47.511 |
| 0.7875 | 47.511 |
| 0.7881944444444445 | 51.951 |
| 0.7888888888888889 | 47.511 |
| 0.7895833333333333 | 47.511 |
| 0.7902777777777777 | 47.511 |
| 0.7909722222222223 | 47.511 |
| 0.7916666666666666 | 47.511 |
| 0.7923611111111111 | 47.511 |
| 0.7930555555555556 | 43.079 |
| 0.7937500000000001 | 43.079 |
| 0.7944444444444444 | 43.079 |
| 0.7951388888888888 | 38.653 |
| 0.7958333333333334 | 38.653 |
| 0.7965277777777778 | 38.653 |
| 0.7972222222222222 | 38.653 |
| 0.7979166666666666 | 38.653 |
| 0.7986111111111112 | 34.234 |
| 0.7993055555555556 | 34.234 |
| 0.7999999999999999 | 34.234 |
| 0.8006944444444444 | 34.234 |
| 0.8013888888888889 | 29.823 |
| 0.8020833333333334 | 29.823 |
| 0.8027777777777777 | 29.823 |
| 0.8034722222222223 | 25.419 |
| 0.8041666666666667 | 25.419 |
| 0.8048611111111111 | 25.419 |
| 0.8055555555555555 | 21.024 |
| 0.80625 | 21.024 |
| 0.8069444444444445 | 21.024 |
| 0.8076388888888889 | 16.636 |
| 0.8083333333333332 | 16.636 |
| 0.8090277777777778 | 12.257 |
| 0.8097222222222222 | 12.257 |
| 0.8104166666666667 | 12.257 |
| 0.811111111111111 | 12.257 |
| 0.8118055555555556 | 7.887 |
| 0.8125 | 7.887 |
| 0.8131944444444444 | 7.887 |
| 0.813888888888889 | 7.887 |
| 0.8145833333333333 | 3.525 |
| 0.8152777777777778 | 3.525 |
| 0.8159722222222222 | 3.525 |
| 0.8166666666666668 | 3.525 |
| 0.8173611111111111 | 3.525 |
| 0.8180555555555555 | 3.525 |
| 0.81875 | 3.525 |
| 0.8194444444444445 | 3.525 |
| 0.8201388888888889 | 0 |
| 0.8208333333333333 | 0 |
| 0.8215277777777777 | 0 |
| 0.8222222222222223 | 0 |
| 0.8229166666666666 | 0 |
| 0.8236111111111111 | 0 |
| 0.8243055555555556 | 0 |
| 0.8250000000000001 | 0 |
| 0.8256944444444444 | 0 |
| 0.8263888888888888 | 0 |
| 0.8270833333333334 | 0 |
| 0.8277777777777778 | 0 |
| 0.8284722222222222 | 0 |
| 0.8291666666666666 | 0 |
| 0.8298611111111112 | 0 |
| 0.8305555555555556 | 0 |
| 0.8312499999999999 | 0 |
| 0.8319444444444444 | 0 |
| 0.8326388888888889 | 0 |
| 0.8333333333333334 | 0 |
| 0.8340277777777777 | 0 |
| 0.8347222222222223 | 0 |
| 0.8354166666666667 | 0 |
| 0.8361111111111111 | 0 |
| 0.8368055555555555 | 0 |
| 0.8375 | 0 |
| 0.8381944444444445 | 0 |
| 0.8388888888888889 | 0 |
| 0.8395833333333332 | 0 |
| 0.8402777777777778 | 0 |
| 0.8409722222222222 | 0 |
| 0.8416666666666667 | 0 |
| 0.842361111111111 | 0 |
| 0.8430555555555556 | 0 |
| 0.84375 | 0 |
| 0.8444444444444444 | 0 |
| 0.845138888888889 | 0 |
| 0.8458333333333333 | 0 |
| 0.8465277777777778 | 0 |
| 0.8472222222222222 | 0 |
| 0.8479166666666668 | 0 |
| 0.8486111111111111 | 0 |
| 0.8493055555555555 | 0 |
| 0.85 | 0 |
| 0.8506944444444445 | 0 |
| 0.8513888888888889 | 0 |
| 0.8520833333333333 | 0 |
| 0.8527777777777777 | 0 |
| 0.8534722222222223 | 0 |
| 0.8541666666666666 | 0 |
| 0.8548611111111111 | 0 |
| 0.8555555555555556 | 0 |
| 0.8562500000000001 | 0 |
| 0.8569444444444444 | 0 |
| 0.8576388888888888 | 0 |
| 0.8583333333333334 | 0 |
| 0.8590277777777778 | 0 |
| 0.8597222222222222 | 0 |
| 0.8604166666666666 | 0 |
| 0.8611111111111112 | 0 |
| 0.8618055555555556 | 0 |
| 0.8624999999999999 | 0 |
| 0.8631944444444444 | 0 |
| 0.8638888888888889 | 0 |
| 0.8645833333333334 | 0 |
| 0.8652777777777777 | 0 |
| 0.8659722222222223 | 0 |
| 0.8666666666666667 | 0 |
| 0.8673611111111111 | 0 |
| 0.8680555555555555 | 0 |
| 0.86875 | 0 |
| 0.8694444444444445 | 0 |
| 0.8701388888888889 | 0 |
| 0.8708333333333332 | 0 |
| 0.8715277777777778 | 0 |
| 0.8722222222222222 | 0 |
| 0.8729166666666667 | 0 |
| 0.873611111111111 | 0 |
| 0.8743055555555556 | 0 |
| 0.875 | 0 |
| 0.8756944444444444 | 0 |
| 0.876388888888889 | 0 |
| 0.8770833333333333 | 0 |
| 0.8777777777777778 | 0 |
| 0.8784722222222222 | 0 |
| 0.8791666666666668 | 0 |
| 0.8798611111111111 | 0 |
| 0.8805555555555555 | 0 |
| 0.88125 | 0 |
| 0.8819444444444445 | 0 |
| 0.8826388888888889 | 0 |
| 0.8833333333333333 | 0 |
| 0.8840277777777777 | 0 |
| 0.8847222222222223 | 0 |
| 0.8854166666666666 | 0 |
| 0.8861111111111111 | 0 |
| 0.8868055555555556 | 0 |
| 0.8875000000000001 | 0 |
| 0.8881944444444444 | 0 |
| 0.8888888888888888 | 0 |
| 0.8895833333333334 | 0 |
| 0.8902777777777778 | 0 |
| 0.8909722222222222 | 0 |
| 0.8916666666666666 | 0 |
| 0.8923611111111112 | 0 |
| 0.8930555555555556 | 0 |
| 0.8937499999999999 | 0 |
| 0.8944444444444444 | 0 |
| 0.8951388888888889 | 0 |
| 0.8958333333333334 | 0 |
| 0.8965277777777777 | 0 |
| 0.8972222222222223 | 0 |
| 0.8979166666666667 | 0 |
| 0.8986111111111111 | 0 |
| 0.8993055555555555 | 0 |
| 0.9 | 0 |
| 0.9006944444444445 | 0 |
| 0.9013888888888889 | 0 |
| 0.9020833333333332 | 0 |
| 0.9027777777777778 | 0 |
| 0.9034722222222222 | 0 |
| 0.9041666666666667 | 0 |
| 0.904861111111111 | 0 |
| 0.9055555555555556 | 0 |
| 0.90625 | 0 |
| 0.9069444444444444 | 0 |
| 0.907638888888889 | 0 |
| 0.9083333333333333 | 0 |
| 0.9090277777777778 | 0 |
| 0.9097222222222222 | 0 |
| 0.9104166666666668 | 0 |
| 0.9111111111111111 | 0 |
| 0.9118055555555555 | 0 |
| 0.9125 | 0 |
| 0.9131944444444445 | 0 |
| 0.9138888888888889 | 0 |
| 0.9145833333333333 | 0 |
| 0.9152777777777777 | 0 |
| 0.9159722222222223 | 0 |
| 0.9166666666666666 | 0 |
| 0.9173611111111111 | 0 |
| 0.9180555555555556 | 0 |
| 0.9187500000000001 | 0 |
| 0.9194444444444444 | 0 |
| 0.9201388888888888 | 0 |
| 0.9208333333333334 | 0 |
| 0.9215277777777778 | 0 |
| 0.9222222222222222 | 0 |
| 0.9229166666666666 | 0 |
| 0.9236111111111112 | 0 |
| 0.9243055555555556 | 0 |
| 0.9249999999999999 | 0 |
| 0.9256944444444444 | 0 |
| 0.9263888888888889 | 0 |
| 0.9270833333333334 | 0 |
| 0.9277777777777777 | 0 |
| 0.9284722222222223 | 0 |
| 0.9291666666666667 | 0 |
| 0.9298611111111111 | 0 |
| 0.9305555555555555 | 0 |
| 0.93125 | 0 |
| 0.9319444444444445 | 0 |
| 0.9326388888888889 | 0 |
| 0.9333333333333332 | 0 |
| 0.9340277777777778 | 0 |
| 0.9347222222222222 | 0 |
| 0.9354166666666667 | 0 |
| 0.936111111111111 | 0 |
| 0.9368055555555556 | 0 |
| 0.9375 | 0 |
| 0.9381944444444444 | 0 |
| 0.938888888888889 | 0 |
| 0.9395833333333333 | 0 |
| 0.9402777777777778 | 0 |
| 0.9409722222222222 | 0 |
| 0.9416666666666668 | 0 |
| 0.9423611111111111 | 0 |
| 0.9430555555555555 | 0 |
| 0.94375 | 0 |
| 0.9444444444444445 | 0 |
| 0.9451388888888889 | 0 |
| 0.9458333333333333 | 0 |
| 0.9465277777777777 | 0 |
| 0.9472222222222223 | 0 |
| 0.9479166666666666 | 0 |
| 0.9486111111111111 | 0 |
| 0.9493055555555556 | 0 |
| 0.9500000000000001 | 0 |
| 0.9506944444444444 | 0 |
| 0.9513888888888888 | 0 |
| 0.9520833333333334 | 0 |
| 0.9527777777777778 | 0 |
| 0.9534722222222222 | 0 |
| 0.9541666666666666 | 0 |
| 0.9548611111111112 | 0 |
| 0.9555555555555556 | 0 |
| 0.9562499999999999 | 0 |
| 0.9569444444444444 | 0 |
| 0.9576388888888889 | 0 |
| 0.9583333333333334 | 0 |
| 0.9590277777777777 | 0 |
| 0.9597222222222223 | 0 |
| 0.9604166666666667 | 0 |
| 0.9611111111111111 | 0 |
| 0.9618055555555555 | 0 |
| 0.9625 | 0 |
| 0.9631944444444445 | 0 |
| 0.9638888888888889 | 0 |
| 0.9645833333333332 | 0 |
| 0.9652777777777778 | 0 |
| 0.9659722222222222 | 0 |
| 0.9666666666666667 | 0 |
| 0.967361111111111 | 0 |
| 0.9680555555555556 | 0 |
| 0.96875 | 0 |
| 0.9694444444444444 | 0 |
| 0.970138888888889 | 0 |
| 0.9708333333333333 | 0 |
| 0.9715277777777778 | 0 |
| 0.9722222222222222 | 0 |
| 0.9729166666666668 | 0 |
| 0.9736111111111111 | 0 |
| 0.9743055555555555 | 0 |
| 0.975 | 0 |
| 0.9756944444444445 | 0 |
| 0.9763888888888889 | 0 |
| 0.9770833333333333 | 0 |
| 0.9777777777777777 | 0 |
| 0.9784722222222223 | 0 |
| 0.9791666666666666 | 0 |
| 0.9798611111111111 | 0 |
| 0.9805555555555556 | 0 |
| 0.9812500000000001 | 0 |
| 0.9819444444444444 | 0 |
| 0.9826388888888888 | 0 |
| 0.9833333333333334 | 0 |
| 0.9840277777777778 | 0 |
| 0.9847222222222222 | 0 |
| 0.9854166666666666 | 0 |
| 0.9861111111111112 | 0 |
| 0.9868055555555556 | 0 |
| 0.9874999999999999 | 0 |
| 0.9881944444444444 | 0 |
| 0.9888888888888889 | 0 |
| 0.9895833333333334 | 0 |
| 0.9902777777777777 | 0 |
| 0.9909722222222223 | 0 |
| 0.9916666666666667 | 0 |
| 0.9923611111111111 | 0 |
| 0.9930555555555555 | 0 |
| 0.99375 | 0 |
| 0.9944444444444445 | 0 |
| 0.9951388888888889 | 0 |
| 0.9958333333333332 | 0 |
| 0.9965277777777778 | 0 |
| 0.9972222222222222 | 0 |
| 0.9979166666666667 | 0 |
| 0.998611111111111 | 0 |
| 0.9993055555555556 | 0 |